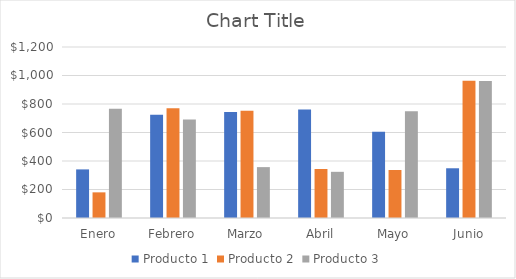
| Category | Producto 1 | Producto 2 | Producto 3 |
|---|---|---|---|
| Enero | 341 | 180 | 766 |
| Febrero | 724 | 771 | 691 |
| Marzo | 744 | 753 | 357 |
| Abril | 761 | 344 | 324 |
| Mayo | 606 | 337 | 750 |
| Junio | 349 | 963 | 961 |